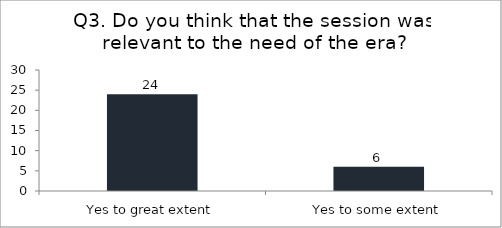
| Category | Q3. Do you think that the session was relevant to the need of the era? |
|---|---|
| Yes to great extent | 24 |
| Yes to some extent | 6 |